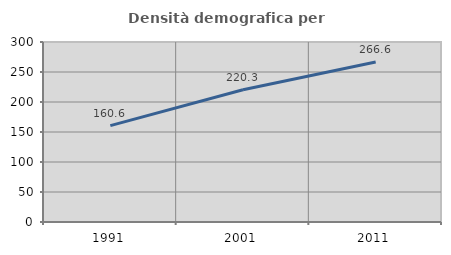
| Category | Densità demografica |
|---|---|
| 1991.0 | 160.589 |
| 2001.0 | 220.316 |
| 2011.0 | 266.577 |